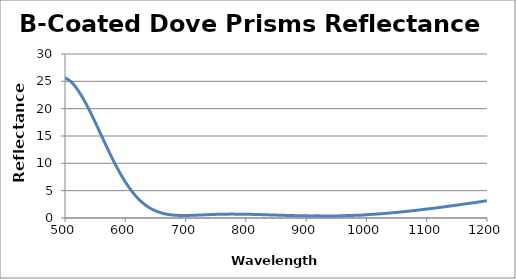
| Category | Reflectance (%) |
|---|---|
| 500.0 | 25.67 |
| 510.0 | 24.927 |
| 520.0 | 23.624 |
| 530.0 | 21.87 |
| 540.0 | 19.812 |
| 550.0 | 17.545 |
| 560.0 | 15.174 |
| 570.0 | 12.812 |
| 580.0 | 10.549 |
| 590.0 | 8.466 |
| 600.0 | 6.609 |
| 610.0 | 5.013 |
| 620.0 | 3.705 |
| 630.0 | 2.67 |
| 640.0 | 1.88 |
| 650.0 | 1.31 |
| 660.0 | 0.919 |
| 670.0 | 0.672 |
| 680.0 | 0.532 |
| 690.0 | 0.47 |
| 700.0 | 0.461 |
| 710.0 | 0.486 |
| 720.0 | 0.528 |
| 730.0 | 0.576 |
| 740.0 | 0.62 |
| 750.0 | 0.662 |
| 760.0 | 0.686 |
| 770.0 | 0.707 |
| 780.0 | 0.709 |
| 790.0 | 0.704 |
| 800.0 | 0.691 |
| 810.0 | 0.665 |
| 820.0 | 0.643 |
| 830.0 | 0.602 |
| 840.0 | 0.568 |
| 850.0 | 0.535 |
| 860.0 | 0.496 |
| 870.0 | 0.464 |
| 880.0 | 0.436 |
| 890.0 | 0.401 |
| 900.0 | 0.395 |
| 910.0 | 0.381 |
| 920.0 | 0.399 |
| 930.0 | 0.357 |
| 940.0 | 0.387 |
| 950.0 | 0.381 |
| 960.0 | 0.402 |
| 970.0 | 0.451 |
| 980.0 | 0.483 |
| 990.0 | 0.51 |
| 1000.0 | 0.603 |
| 1010.0 | 0.677 |
| 1020.0 | 0.737 |
| 1030.0 | 0.834 |
| 1040.0 | 0.921 |
| 1050.0 | 1.024 |
| 1060.0 | 1.134 |
| 1070.0 | 1.251 |
| 1080.0 | 1.371 |
| 1090.0 | 1.499 |
| 1100.0 | 1.635 |
| 1110.0 | 1.759 |
| 1120.0 | 1.906 |
| 1130.0 | 2.058 |
| 1140.0 | 2.205 |
| 1150.0 | 2.357 |
| 1160.0 | 2.517 |
| 1170.0 | 2.672 |
| 1180.0 | 2.827 |
| 1190.0 | 2.994 |
| 1200.0 | 3.16 |